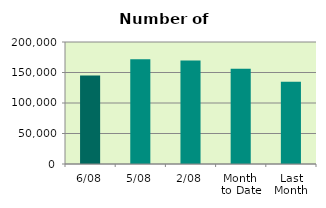
| Category | Series 0 |
|---|---|
| 6/08 | 144968 |
| 5/08 | 171628 |
| 2/08 | 169488 |
| Month 
to Date | 156025.5 |
| Last
Month | 134976 |